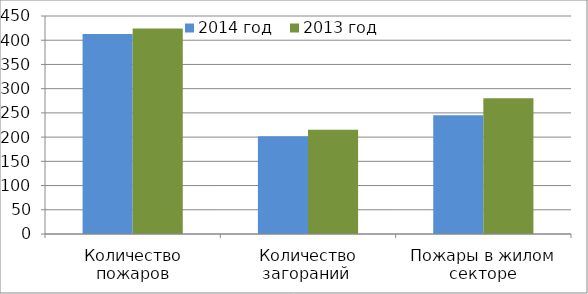
| Category | 2014 год | 2013 год |
|---|---|---|
| Количество пожаров | 413 | 424 |
| Количество загораний  | 202 | 215 |
| Пожары в жилом секторе | 245 | 280 |